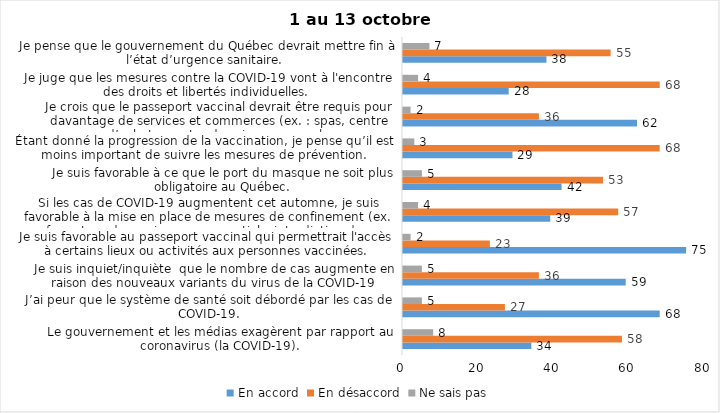
| Category | En accord | En désaccord | Ne sais pas |
|---|---|---|---|
| Le gouvernement et les médias exagèrent par rapport au coronavirus (la COVID-19). | 34 | 58 | 8 |
| J’ai peur que le système de santé soit débordé par les cas de COVID-19. | 68 | 27 | 5 |
| Je suis inquiet/inquiète  que le nombre de cas augmente en raison des nouveaux variants du virus de la COVID-19 | 59 | 36 | 5 |
| Je suis favorable au passeport vaccinal qui permettrait l'accès à certains lieux ou activités aux personnes vaccinées. | 75 | 23 | 2 |
| Si les cas de COVID-19 augmentent cet automne, je suis favorable à la mise en place de mesures de confinement (ex. fermeture de services non essentiels, interdiction des rassemblements privés) | 39 | 57 | 4 |
| Je suis favorable à ce que le port du masque ne soit plus obligatoire au Québec. | 42 | 53 | 5 |
| Étant donné la progression de la vaccination, je pense qu’il est moins important de suivre les mesures de prévention. | 29 | 68 | 3 |
| Je crois que le passeport vaccinal devrait être requis pour davantage de services et commerces (ex. : spas, centre d’achats, centre de soins personnels. | 62 | 36 | 2 |
| Je juge que les mesures contre la COVID-19 vont à l'encontre des droits et libertés individuelles.  | 28 | 68 | 4 |
| Je pense que le gouvernement du Québec devrait mettre fin à l’état d’urgence sanitaire.  | 38 | 55 | 7 |